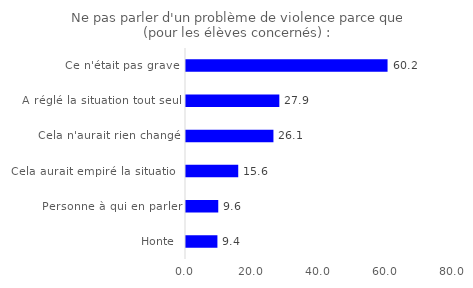
| Category | Series 0 |
|---|---|
| Ce n'était pas grave | 60.166 |
| A réglé la situation tout seul | 27.859 |
| Cela n'aurait rien changé | 26.1 |
| Cela aurait empiré la situation | 15.591 |
| Personne à qui en parler | 9.63 |
| Honte | 9.377 |